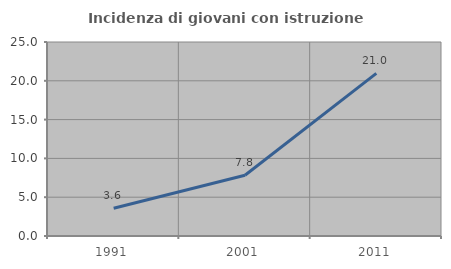
| Category | Incidenza di giovani con istruzione universitaria |
|---|---|
| 1991.0 | 3.571 |
| 2001.0 | 7.826 |
| 2011.0 | 20.952 |